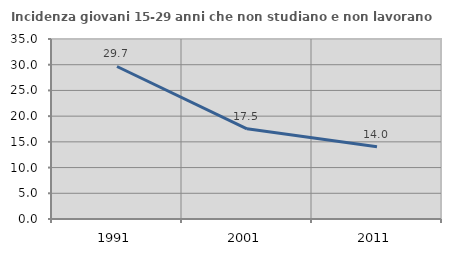
| Category | Incidenza giovani 15-29 anni che non studiano e non lavorano  |
|---|---|
| 1991.0 | 29.655 |
| 2001.0 | 17.544 |
| 2011.0 | 14.035 |